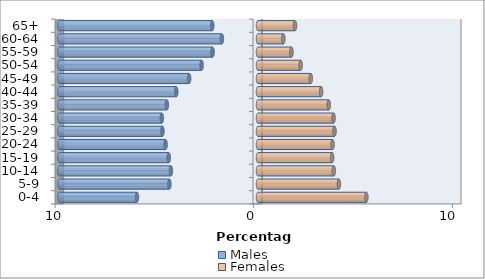
| Category | Males | Females |
|---|---|---|
| 0-4 | -6.093 | 5.455 |
| 5-9 | -4.461 | 4.073 |
| 10-14 | -4.383 | 3.819 |
| 15-19 | -4.492 | 3.733 |
| 20-24 | -4.651 | 3.753 |
| 25-29 | -4.811 | 3.852 |
| 30-34 | -4.841 | 3.803 |
| 35-39 | -4.588 | 3.562 |
| 40-44 | -4.113 | 3.177 |
| 45-49 | -3.468 | 2.656 |
| 50-54 | -2.839 | 2.147 |
| 55-59 | -2.286 | 1.684 |
| 60-64 | -1.818 | 1.275 |
| 65+ | -2.303 | 1.862 |